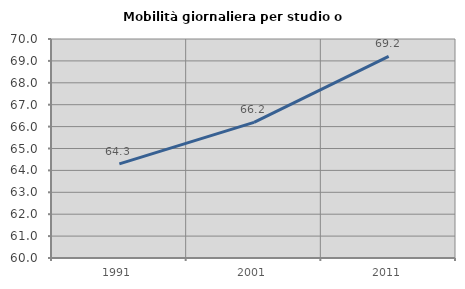
| Category | Mobilità giornaliera per studio o lavoro |
|---|---|
| 1991.0 | 64.296 |
| 2001.0 | 66.195 |
| 2011.0 | 69.208 |